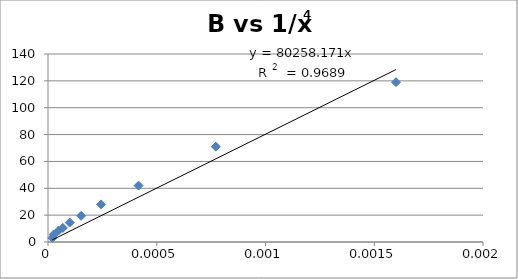
| Category | B |
|---|---|
| 0.0016 | 119 |
| 0.0007716049382716049 | 71 |
| 0.00041649312786339027 | 42 |
| 0.000244140625 | 28 |
| 0.00015241579027587258 | 19.5 |
| 0.0001 | 14.5 |
| 6.830134553650706e-05 | 10.5 |
| 4.8225308641975306e-05 | 8.5 |
| 2.6030820491461892e-05 | 5.5 |
| 1.9753086419753087e-05 | 3 |